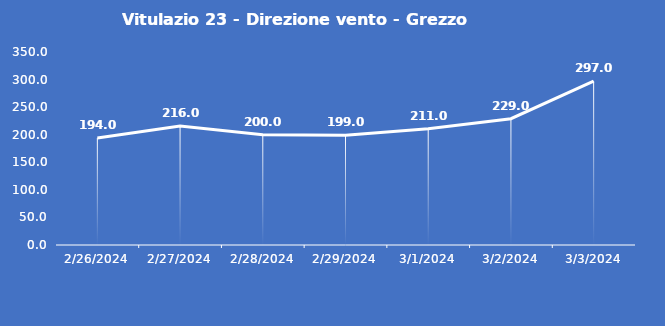
| Category | Vitulazio 23 - Direzione vento - Grezzo (°N) |
|---|---|
| 2/26/24 | 194 |
| 2/27/24 | 216 |
| 2/28/24 | 200 |
| 2/29/24 | 199 |
| 3/1/24 | 211 |
| 3/2/24 | 229 |
| 3/3/24 | 297 |